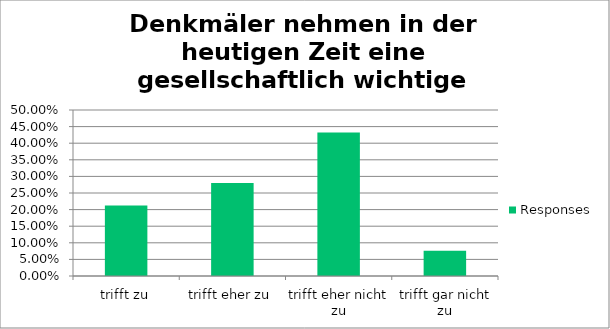
| Category | Responses |
|---|---|
| trifft zu | 0.212 |
| trifft eher zu | 0.28 |
| trifft eher nicht zu | 0.432 |
| trifft gar nicht zu | 0.076 |